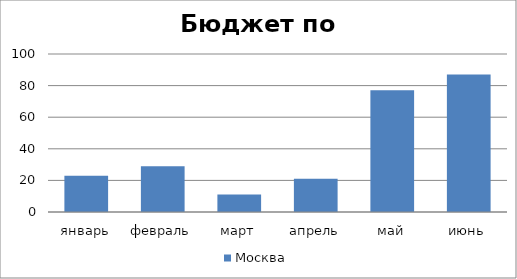
| Category | Москва |
|---|---|
| январь | 23 |
| февраль | 29 |
| март | 11 |
| апрель | 21 |
| май | 77 |
| июнь | 87 |